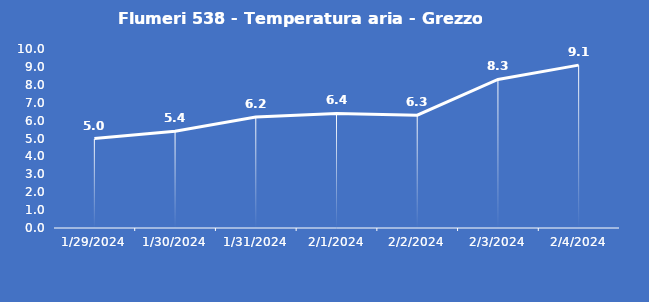
| Category | Flumeri 538 - Temperatura aria - Grezzo (°C) |
|---|---|
| 1/29/24 | 5 |
| 1/30/24 | 5.4 |
| 1/31/24 | 6.2 |
| 2/1/24 | 6.4 |
| 2/2/24 | 6.3 |
| 2/3/24 | 8.3 |
| 2/4/24 | 9.1 |